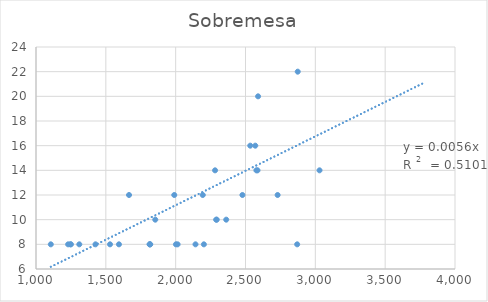
| Category | Sobremesa |
|---|---|
| 2202.0 | 8 |
| 1310.0 | 8 |
| 2194.0 | 12 |
| 1106.0 | 8 |
| 1814.0 | 8 |
| 2002.0 | 8 |
| 2362.0 | 10 |
| 1230.0 | 8 |
| 2586.0 | 14 |
| 1854.0 | 10 |
| 2534.0 | 16 |
| 2570.0 | 16 |
| 1246.0 | 8 |
| 1990.0 | 12 |
| 1594.0 | 8 |
| 2578.0 | 14 |
| 1530.0 | 8 |
| 2478.0 | 12 |
| 1666.0 | 12 |
| 2282.0 | 14 |
| 2142.0 | 8 |
| 3030.0 | 14 |
| 2590.0 | 20 |
| 2874.0 | 22 |
| 2014.0 | 8 |
| 3350.0 | 28 |
| 1250.0 | 8 |
| 2870.0 | 8 |
| 1814.0 | 8 |
| 3770.0 | 28 |
| 2294.0 | 10 |
| 2730.0 | 12 |
| 2290.0 | 10 |
| 1818.0 | 8 |
| 1426.0 | 8 |